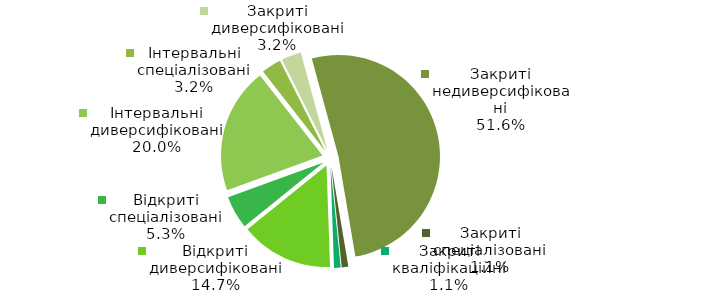
| Category | Series 0 |
|---|---|
| Відкриті диверсифіковані | 14 |
| Відкриті спеціалізовані | 5 |
| Інтервальні диверсифіковані | 19 |
| Інтервальні спеціалізовані | 3 |
| Закриті диверсифіковані | 3 |
| Закриті недиверсифіковані | 49 |
| Закриті спеціалізовані | 1 |
| Закриті кваліфікаційні | 1 |